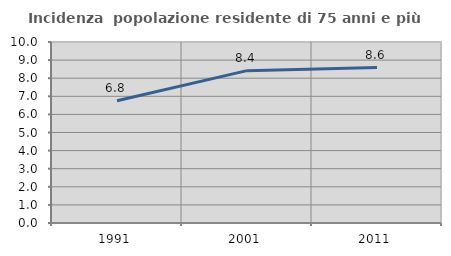
| Category | Incidenza  popolazione residente di 75 anni e più |
|---|---|
| 1991.0 | 6.752 |
| 2001.0 | 8.417 |
| 2011.0 | 8.585 |